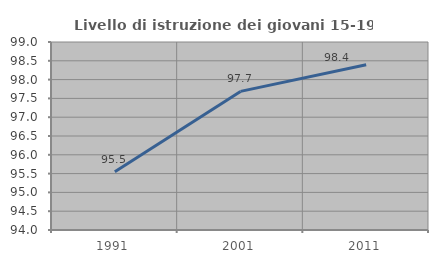
| Category | Livello di istruzione dei giovani 15-19 anni |
|---|---|
| 1991.0 | 95.55 |
| 2001.0 | 97.686 |
| 2011.0 | 98.393 |